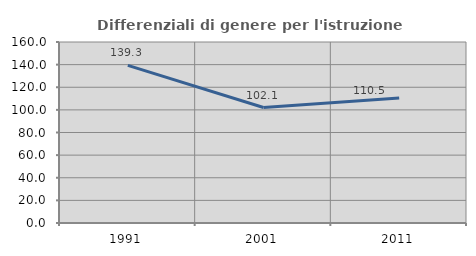
| Category | Differenziali di genere per l'istruzione superiore |
|---|---|
| 1991.0 | 139.292 |
| 2001.0 | 102.089 |
| 2011.0 | 110.5 |